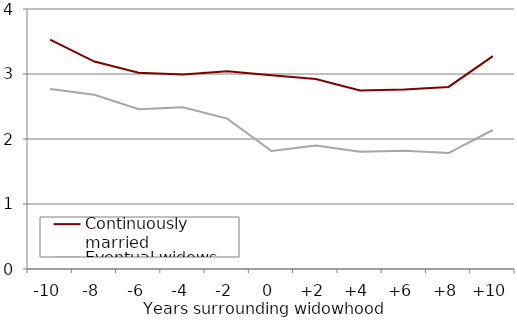
| Category | Continuously married | Eventual widows |
|---|---|---|
| -10 | 3.528 | 2.77 |
| -8 | 3.191 | 2.68 |
| -6 | 3.021 | 2.459 |
| -4 | 2.994 | 2.487 |
| -2 | 3.04 | 2.313 |
| 0 | 2.981 | 1.815 |
| +2 | 2.922 | 1.901 |
| +4 | 2.747 | 1.803 |
| +6 | 2.763 | 1.819 |
| +8 | 2.801 | 1.784 |
| +10 | 3.275 | 2.138 |